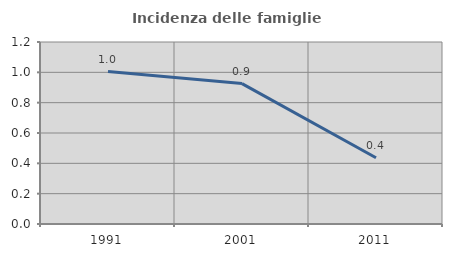
| Category | Incidenza delle famiglie numerose |
|---|---|
| 1991.0 | 1.005 |
| 2001.0 | 0.926 |
| 2011.0 | 0.437 |